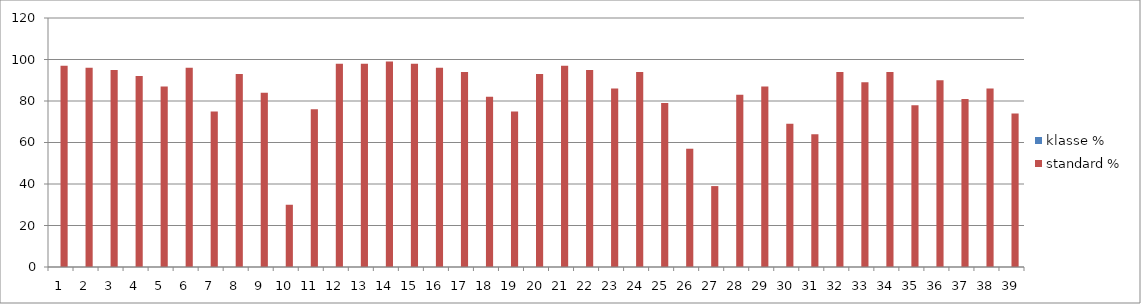
| Category | klasse % | standard % |
|---|---|---|
| 0 | 0 | 97 |
| 1 | 0 | 96 |
| 2 | 0 | 95 |
| 3 | 0 | 92 |
| 4 | 0 | 87 |
| 5 | 0 | 96 |
| 6 | 0 | 75 |
| 7 | 0 | 93 |
| 8 | 0 | 84 |
| 9 | 0 | 30 |
| 10 | 0 | 76 |
| 11 | 0 | 98 |
| 12 | 0 | 98 |
| 13 | 0 | 99 |
| 14 | 0 | 98 |
| 15 | 0 | 96 |
| 16 | 0 | 94 |
| 17 | 0 | 82 |
| 18 | 0 | 75 |
| 19 | 0 | 93 |
| 20 | 0 | 97 |
| 21 | 0 | 95 |
| 22 | 0 | 86 |
| 23 | 0 | 94 |
| 24 | 0 | 79 |
| 25 | 0 | 57 |
| 26 | 0 | 39 |
| 27 | 0 | 83 |
| 28 | 0 | 87 |
| 29 | 0 | 69 |
| 30 | 0 | 64 |
| 31 | 0 | 94 |
| 32 | 0 | 89 |
| 33 | 0 | 94 |
| 34 | 0 | 78 |
| 35 | 0 | 90 |
| 36 | 0 | 81 |
| 37 | 0 | 86 |
| 38 | 0 | 74 |